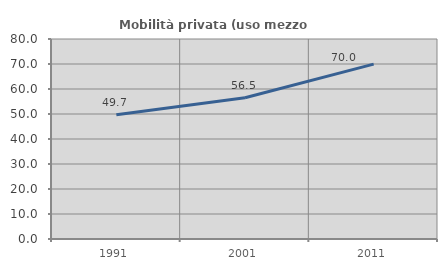
| Category | Mobilità privata (uso mezzo privato) |
|---|---|
| 1991.0 | 49.733 |
| 2001.0 | 56.5 |
| 2011.0 | 69.955 |